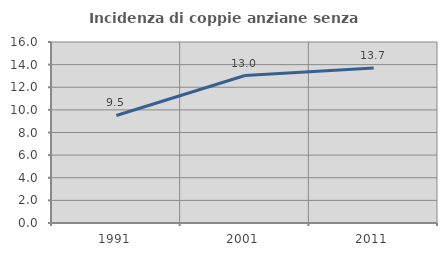
| Category | Incidenza di coppie anziane senza figli  |
|---|---|
| 1991.0 | 9.507 |
| 2001.0 | 13.035 |
| 2011.0 | 13.692 |